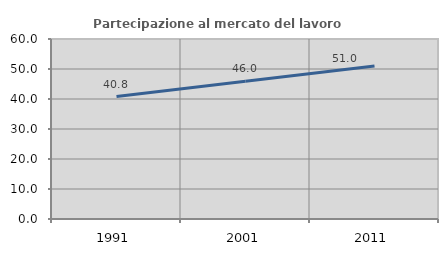
| Category | Partecipazione al mercato del lavoro  femminile |
|---|---|
| 1991.0 | 40.825 |
| 2001.0 | 45.953 |
| 2011.0 | 51.014 |